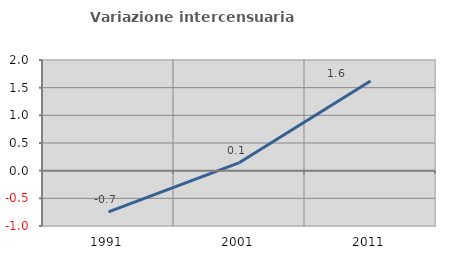
| Category | Variazione intercensuaria annua |
|---|---|
| 1991.0 | -0.744 |
| 2001.0 | 0.147 |
| 2011.0 | 1.622 |